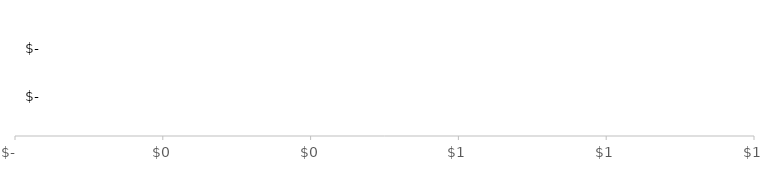
| Category | TOTALE FINANZIAMENTO | TOTALE SPESE |
|---|---|---|
| 0 | 0 | 0 |